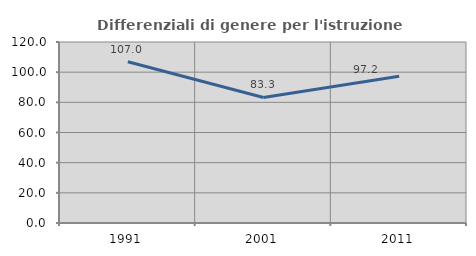
| Category | Differenziali di genere per l'istruzione superiore |
|---|---|
| 1991.0 | 106.955 |
| 2001.0 | 83.251 |
| 2011.0 | 97.244 |